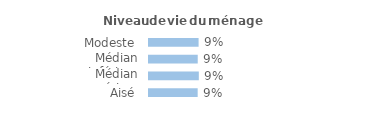
| Category | Series 0 |
|---|---|
| Modeste | 0.087 |
| Médian inférieur | 0.086 |
| Médian supérieur | 0.087 |
| Aisé | 0.085 |